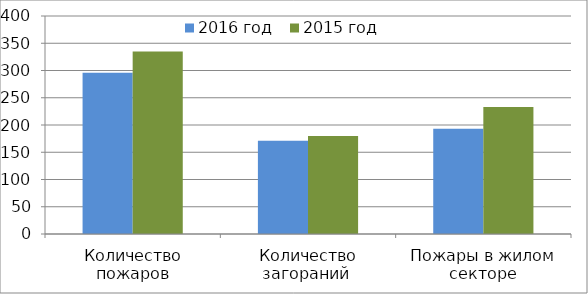
| Category | 2016 год | 2015 год |
|---|---|---|
| Количество пожаров | 296 | 335 |
| Количество загораний  | 171 | 180 |
| Пожары в жилом секторе | 193 | 233 |